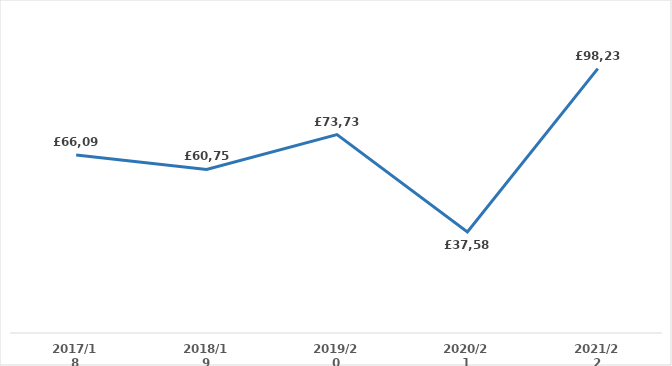
| Category | Series 0 |
|---|---|
| 2017/18 | 66094.13 |
| 2018/19 | 60752.28 |
| 2019/20 | 73736.78 |
| 2020/21 | 37582.21 |
| 2021/22 | 98233.92 |